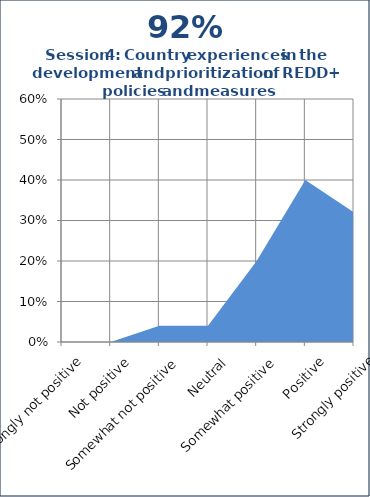
| Category | Series 1 |
|---|---|
| Strongly not positive | 0 |
| Not positive | 0 |
| Somewhat not positive | 0.04 |
| Neutral | 0.04 |
| Somewhat positive | 0.2 |
| Positive | 0.4 |
| Strongly positive | 0.32 |